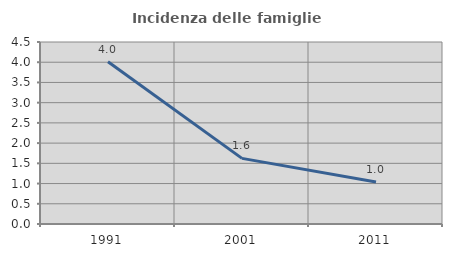
| Category | Incidenza delle famiglie numerose |
|---|---|
| 1991.0 | 4.012 |
| 2001.0 | 1.623 |
| 2011.0 | 1.04 |